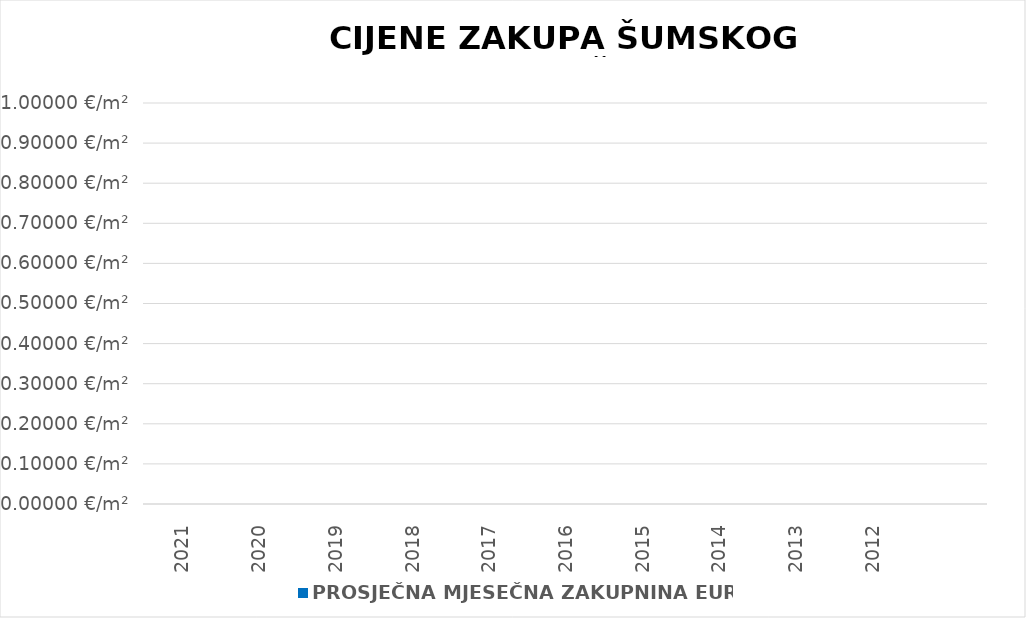
| Category | PROSJEČNA MJESEČNA ZAKUPNINA EUR/m2 |
|---|---|
| 2021 | 0 |
| 2020 | 0 |
| 2019 | 0 |
| 2018 | 0 |
| 2017 | 0 |
| 2016 | 0 |
| 2015 | 0 |
| 2014 | 0 |
| 2013 | 0 |
| 2012 | 0 |